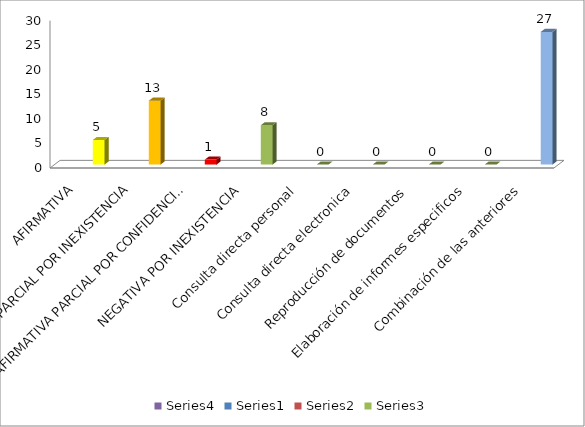
| Category | Series 3 | Series 0 | Series 1 | Series 2 |
|---|---|---|---|---|
| AFIRMATIVA |  |  |  | 5 |
| AFIRMATIVA PARCIAL POR INEXISTENCIA |  |  |  | 13 |
| AFIRMATIVA PARCIAL POR CONFIDENCIALIDAD |  |  |  | 1 |
| NEGATIVA POR INEXISTENCIA |  |  |  | 8 |
| Consulta directa personal |  |  |  | 0 |
| Consulta directa electronica |  |  |  | 0 |
| Reproducción de documentos |  |  |  | 0 |
| Elaboración de informes especificos |  |  |  | 0 |
| Combinación de las anteriores |  |  |  | 27 |